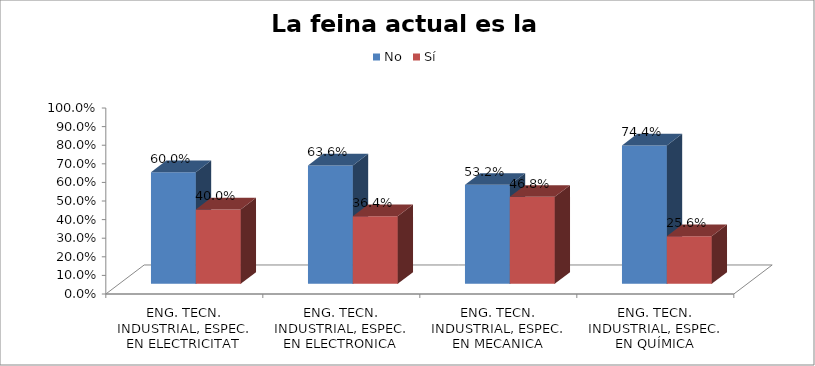
| Category | No | Sí |
|---|---|---|
| ENG. TECN. INDUSTRIAL, ESPEC. EN ELECTRICITAT | 0.6 | 0.4 |
| ENG. TECN. INDUSTRIAL, ESPEC. EN ELECTRONICA INDUSTRIAL | 0.636 | 0.364 |
| ENG. TECN. INDUSTRIAL, ESPEC. EN MECANICA | 0.532 | 0.468 |
| ENG. TECN. INDUSTRIAL, ESPEC. EN QUÍMICA INDUSTRIAL | 0.744 | 0.256 |